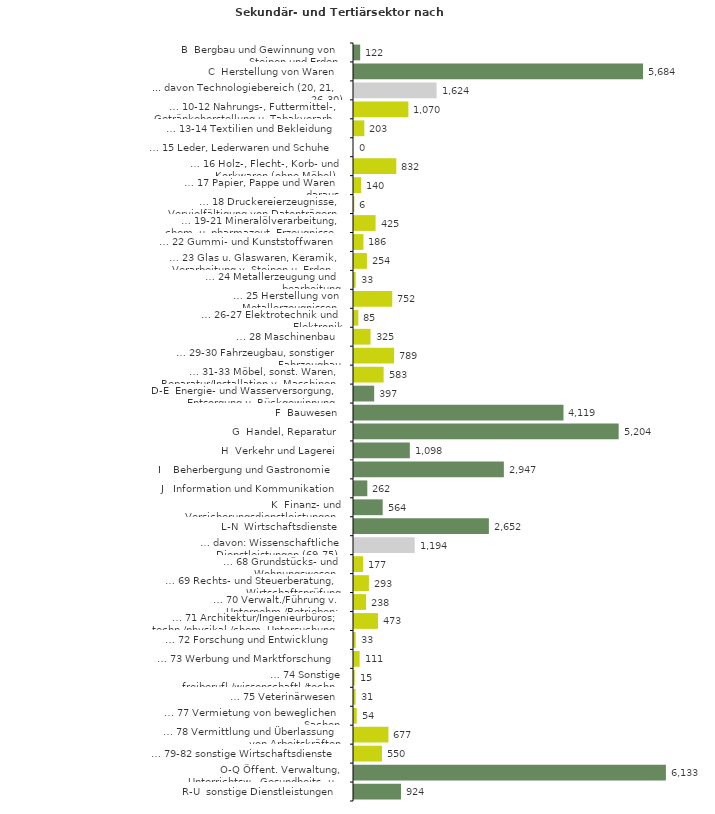
| Category | Series 0 |
|---|---|
| B  Bergbau und Gewinnung von Steinen und Erden | 122 |
| C  Herstellung von Waren | 5684 |
| ... davon Technologiebereich (20, 21, 26-30) | 1624 |
| … 10-12 Nahrungs-, Futtermittel-, Getränkeherstellung u. Tabakverarb. | 1070 |
| … 13-14 Textilien und Bekleidung | 203 |
| … 15 Leder, Lederwaren und Schuhe | 0 |
| … 16 Holz-, Flecht-, Korb- und Korkwaren (ohne Möbel)  | 832 |
| … 17 Papier, Pappe und Waren daraus  | 140 |
| … 18 Druckereierzeugnisse, Vervielfältigung von Datenträgern | 6 |
| … 19-21 Mineralölverarbeitung, chem. u. pharmazeut. Erzeugnisse | 425 |
| … 22 Gummi- und Kunststoffwaren | 186 |
| … 23 Glas u. Glaswaren, Keramik, Verarbeitung v. Steinen u. Erden  | 254 |
| … 24 Metallerzeugung und -bearbeitung | 33 |
| … 25 Herstellung von Metallerzeugnissen  | 752 |
| … 26-27 Elektrotechnik und Elektronik | 85 |
| … 28 Maschinenbau | 325 |
| … 29-30 Fahrzeugbau, sonstiger Fahrzeugbau | 789 |
| … 31-33 Möbel, sonst. Waren, Reparatur/Installation v. Maschinen | 583 |
| D-E  Energie- und Wasserversorgung, Entsorgung u. Rückgewinnung | 397 |
| F  Bauwesen | 4119 |
| G  Handel, Reparatur | 5204 |
| H  Verkehr und Lagerei | 1098 |
| I    Beherbergung und Gastronomie | 2947 |
| J   Information und Kommunikation | 262 |
| K  Finanz- und Versicherungsdienstleistungen | 564 |
| L-N  Wirtschaftsdienste | 2652 |
| … davon: Wissenschaftliche Dienstleistungen (69-75) | 1194 |
| … 68 Grundstücks- und Wohnungswesen  | 177 |
| … 69 Rechts- und Steuerberatung, Wirtschaftsprüfung | 293 |
| … 70 Verwalt./Führung v. Unternehm./Betrieben; Unternehmensberat. | 238 |
| … 71 Architektur/Ingenieurbüros; techn./physikal./chem. Untersuchung | 473 |
| … 72 Forschung und Entwicklung  | 33 |
| … 73 Werbung und Marktforschung | 111 |
| … 74 Sonstige freiberufl./wissenschaftl./techn. Tätigkeiten | 15 |
| … 75 Veterinärwesen | 31 |
| … 77 Vermietung von beweglichen Sachen  | 54 |
| … 78 Vermittlung und Überlassung von Arbeitskräften | 677 |
| … 79-82 sonstige Wirtschaftsdienste | 550 |
| O-Q Öffent. Verwaltung, Unterrichtsw., Gesundheits- u. Sozialwesen | 6133 |
| R-U  sonstige Dienstleistungen | 924 |